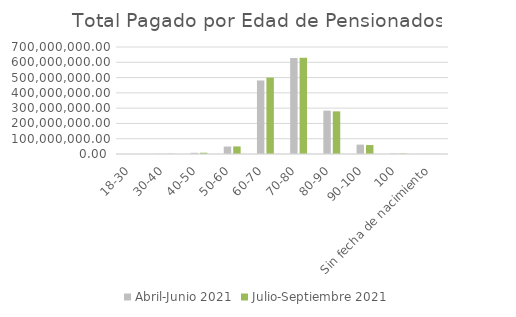
| Category | Abril-Junio 2021 | Julio-Septiembre 2021 |
|---|---|---|
| 18-30 | 120807.35 | 153307.35 |
| 30-40 | 1322300.99 | 1330300.99 |
| 40-50 | 7897693.6 | 8305485.03 |
| 50-60 | 48706254.04 | 49669578.49 |
| 60-70 | 480986552.06 | 500030857.2 |
| 70-80 | 627894030.27 | 630197395.36 |
| 80-90 | 283756170.79 | 279039811.43 |
| 90-100 | 61447621.31 | 58604594.23 |
| 100 | 3305330.89 | 3124466.42 |
| Sin fecha de nacimiento | 1154866.88 | 506866.88 |